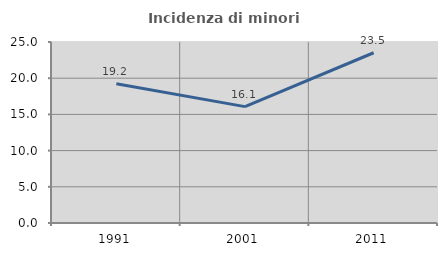
| Category | Incidenza di minori stranieri |
|---|---|
| 1991.0 | 19.231 |
| 2001.0 | 16.071 |
| 2011.0 | 23.516 |